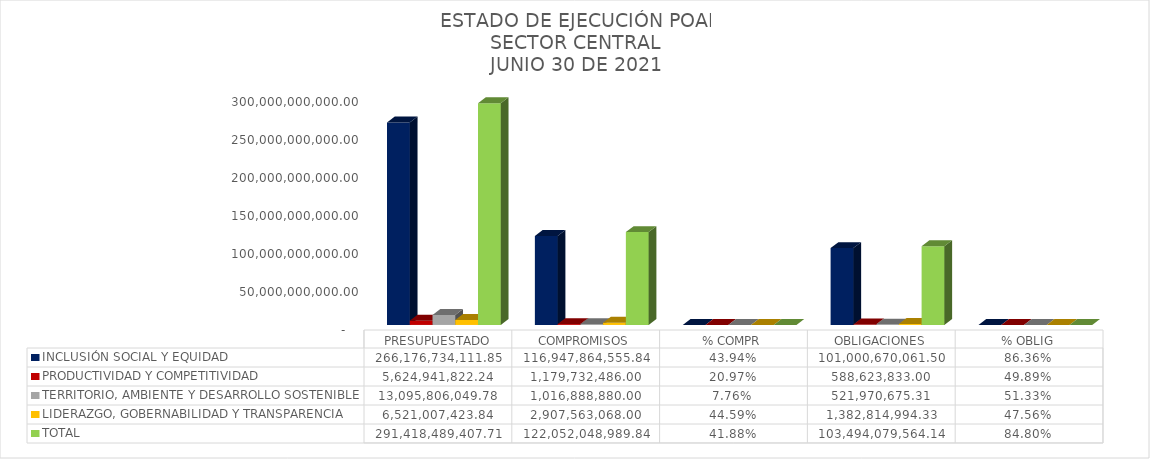
| Category | INCLUSIÓN SOCIAL Y EQUIDAD  | PRODUCTIVIDAD Y COMPETITIVIDAD | TERRITORIO, AMBIENTE Y DESARROLLO SOSTENIBLE  | LIDERAZGO, GOBERNABILIDAD Y TRANSPARENCIA  | TOTAL |
|---|---|---|---|---|---|
| PRESUPUESTADO | 266176734111.85 | 5624941822.24 | 13095806049.78 | 6521007423.84 | 291418489407.71 |
| COMPROMISOS | 116947864555.84 | 1179732486 | 1016888880 | 2907563068 | 122052048989.84 |
| % COMPR | 0.439 | 0.21 | 0.078 | 0.446 | 0.419 |
| OBLIGACIONES | 101000670061.5 | 588623833 | 521970675.31 | 1382814994.33 | 103494079564.14 |
| % OBLIG | 0.864 | 0.499 | 0.513 | 0.476 | 0.848 |